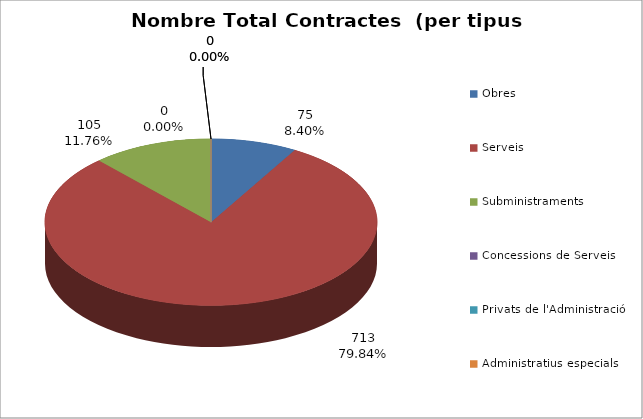
| Category | Nombre Total Contractes |
|---|---|
| Obres | 75 |
| Serveis | 713 |
| Subministraments | 105 |
| Concessions de Serveis | 0 |
| Privats de l'Administració | 0 |
| Administratius especials | 0 |